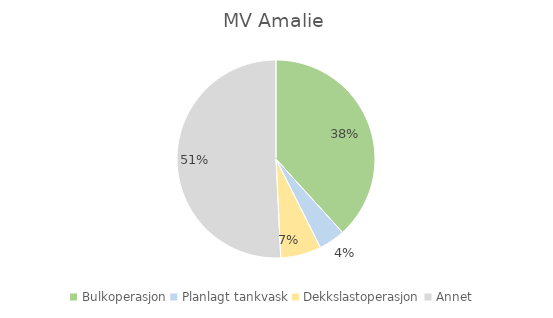
| Category | Series 0 |
|---|---|
| Bulkoperasjon | 0.383 |
| Planlagt tankvask | 0.043 |
| Dekkslastoperasjon | 0.066 |
| Annet | 0.508 |